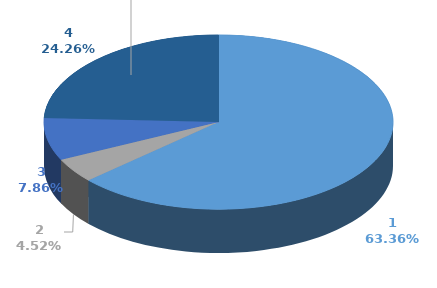
| Category | Series 0 | Series 1 |
|---|---|---|
| 0 | 1467789 |  |
| 1 | 104772 |  |
| 2 | 182029 |  |
| 3 | 562118 |  |